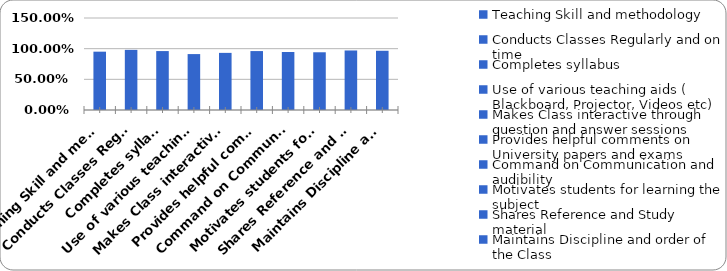
| Category | Series 0 |
|---|---|
| Teaching Skill and methodology | 0.951 |
| Conducts Classes Regularly and on time | 0.98 |
| Completes syllabus | 0.961 |
| Use of various teaching aids ( Blackboard, Projector, Videos etc) | 0.912 |
| Makes Class interactive through question and answer sessions | 0.931 |
| Provides helpful comments on University papers and exams | 0.961 |
| Command on Communication and audibility  | 0.946 |
| Motivates students for learning the subject | 0.941 |
| Shares Reference and Study material  | 0.971 |
| Maintains Discipline and order of the Class | 0.966 |